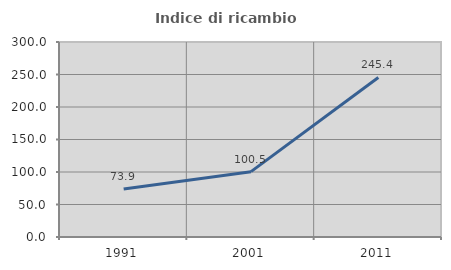
| Category | Indice di ricambio occupazionale  |
|---|---|
| 1991.0 | 73.92 |
| 2001.0 | 100.545 |
| 2011.0 | 245.419 |